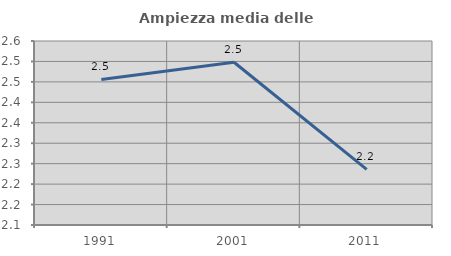
| Category | Ampiezza media delle famiglie |
|---|---|
| 1991.0 | 2.456 |
| 2001.0 | 2.498 |
| 2011.0 | 2.236 |